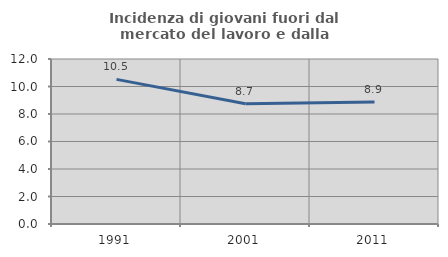
| Category | Incidenza di giovani fuori dal mercato del lavoro e dalla formazione  |
|---|---|
| 1991.0 | 10.519 |
| 2001.0 | 8.741 |
| 2011.0 | 8.871 |